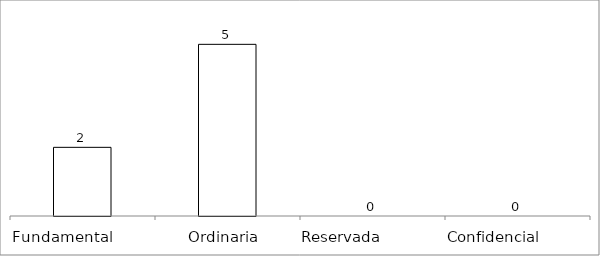
| Category | Series 0 |
|---|---|
| Fundamental         | 2 |
| Ordinaria  | 5 |
| Reservada               | 0 |
| Confidencial             | 0 |